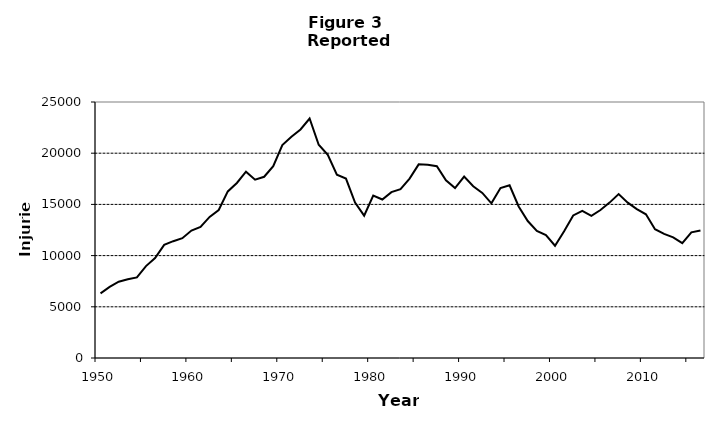
| Category | Series 1 |
|---|---|
| 1950.0 | 6314 |
| 1951.0 | 6938 |
| 1952.0 | 7448 |
| 1953.0 | 7686 |
| 1954.0 | 7875 |
| 1955.0 | 8976 |
| 1956.0 | 9758 |
| 1957.0 | 11053 |
| 1958.0 | 11408 |
| 1959.0 | 11703 |
| 1960.0 | 12443 |
| 1961.0 | 12796 |
| 1962.0 | 13776 |
| 1963.0 | 14447 |
| 1964.0 | 16266 |
| 1965.0 | 17093 |
| 1966.0 | 18194 |
| 1967.0 | 17409 |
| 1968.0 | 17698 |
| 1969.0 | 18726 |
| 1970.0 | 20791 |
| 1971.0 | 21607 |
| 1972.0 | 22315 |
| 1973.0 | 23385 |
| 1974.0 | 20829 |
| 1975.0 | 19839 |
| 1976.0 | 17895 |
| 1977.0 | 17525 |
| 1978.0 | 15178 |
| 1979.0 | 13903 |
| 1980.0 | 15872 |
| 1981.0 | 15479 |
| 1982.0 | 16194 |
| 1983.0 | 16491 |
| 1984.0 | 17524 |
| 1985.0 | 18912 |
| 1986.0 | 18874 |
| 1987.0 | 18728 |
| 1988.0 | 17346 |
| 1989.0 | 16594 |
| 1990.0 | 17719 |
| 1991.0 | 16767 |
| 1992.0 | 16121 |
| 1993.0 | 15108 |
| 1994.0 | 16600 |
| 1995.0 | 16870 |
| 1996.0 | 14796 |
| 1997.0 | 13375 |
| 1998.0 | 12412 |
| 1999.0 | 11999 |
| 2000.0 | 10962 |
| 2001.0 | 12368 |
| 2002.0 | 13918 |
| 2003.0 | 14372 |
| 2004.0 | 13890 |
| 2005.0 | 14451 |
| 2006.0 | 15174 |
| 2007.0 | 16013 |
| 2008.0 | 15174 |
| 2009.0 | 14541 |
| 2010.0 | 14031 |
| 2011.0 | 12574 |
| 2012.0 | 12122 |
| 2013.0 | 11781 |
| 2014.0 | 11219 |
| 2015.0 | 12270 |
| 2016.0 | 12456 |